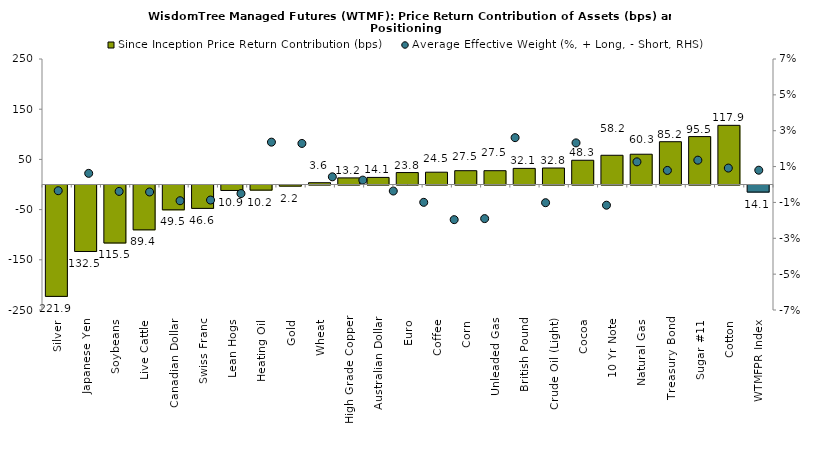
| Category | Since Inception Price Return Contribution (bps) |
|---|---|
| Silver | -221.88 |
| Japanese Yen | -132.464 |
| Soybeans | -115.516 |
| Live Cattle | -89.371 |
| Canadian Dollar | -49.484 |
| Swiss Franc | -46.582 |
| Lean Hogs | -10.865 |
| Heating Oil | -10.215 |
| Gold | -2.228 |
| Wheat | 3.563 |
| High Grade Copper | 13.166 |
| Australian Dollar | 14.104 |
| Euro | 23.805 |
| Coffee | 24.509 |
| Corn | 27.502 |
| Unleaded Gas | 27.503 |
| British Pound | 32.112 |
| Crude Oil (Light) | 32.845 |
| Cocoa | 48.287 |
| 10 Yr Note | 58.223 |
| Natural Gas | 60.308 |
| Treasury Bond | 85.229 |
| Sugar #11 | 95.459 |
| Cotton | 117.859 |
| WTMFPR Index | -14.13 |